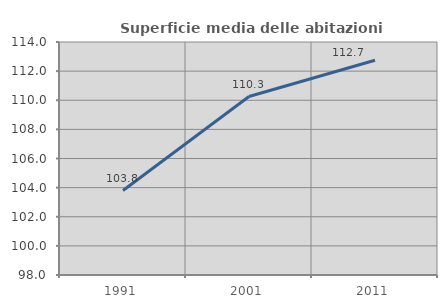
| Category | Superficie media delle abitazioni occupate |
|---|---|
| 1991.0 | 103.801 |
| 2001.0 | 110.255 |
| 2011.0 | 112.749 |